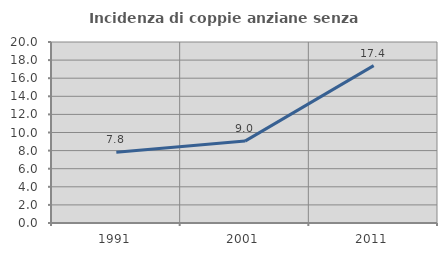
| Category | Incidenza di coppie anziane senza figli  |
|---|---|
| 1991.0 | 7.812 |
| 2001.0 | 9.048 |
| 2011.0 | 17.391 |